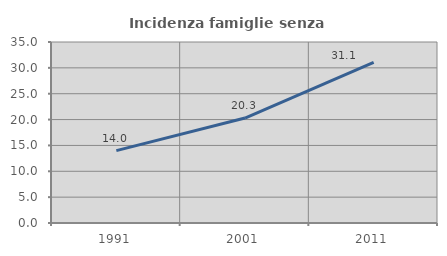
| Category | Incidenza famiglie senza nuclei |
|---|---|
| 1991.0 | 13.988 |
| 2001.0 | 20.299 |
| 2011.0 | 31.083 |